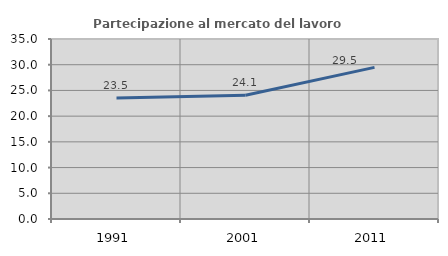
| Category | Partecipazione al mercato del lavoro  femminile |
|---|---|
| 1991.0 | 23.544 |
| 2001.0 | 24.071 |
| 2011.0 | 29.481 |